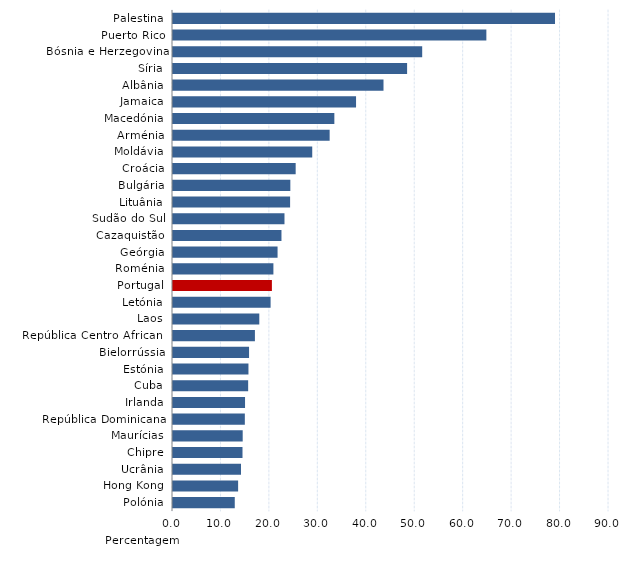
| Category | Series 0 |
|---|---|
|    Palestina | 78.856 |
|    Puerto Rico | 64.685 |
|    Bósnia e Herzegovina | 51.44 |
|    Síria | 48.325 |
|    Albânia | 43.452 |
|    Jamaica | 37.787 |
|    Macedónia | 33.306 |
|    Arménia | 32.336 |
|    Moldávia | 28.742 |
|    Croácia | 25.322 |
|    Bulgária | 24.222 |
|    Lituânia | 24.173 |
|    Sudão do Sul | 23.012 |
|    Cazaquistão | 22.389 |
|    Geórgia | 21.585 |
|    Roménia | 20.725 |
|    Portugal | 20.413 |
|    Letónia | 20.147 |
|    Laos | 17.814 |
|    República Centro Africana | 16.909 |
|    Bielorrússia | 15.701 |
|    Estónia | 15.577 |
|    Cuba | 15.515 |
|    Irlanda | 14.871 |
|    República Dominicana | 14.828 |
|    Maurícias | 14.387 |
|    Chipre | 14.346 |
|    Ucrânia | 14.038 |
|    Hong Kong | 13.443 |
|    Polónia | 12.749 |